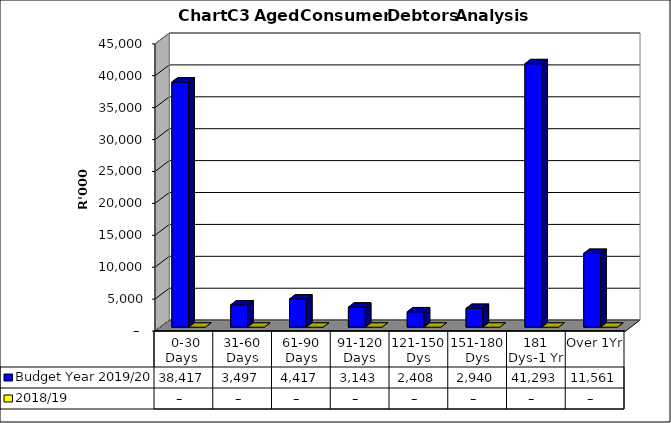
| Category | Budget Year 2019/20 | 2018/19 |
|---|---|---|
|  0-30 Days  | 38416619.65 | 0 |
| 31-60 Days | 3497057.97 | 0 |
| 61-90 Days | 4416798.32 | 0 |
| 91-120 Days | 3143204.99 | 0 |
| 121-150 Dys | 2407555.55 | 0 |
| 151-180 Dys | 2940099.71 | 0 |
| 181 Dys-1 Yr | 41293292.73 | 0 |
| Over 1Yr | 11561394.26 | 0 |